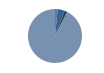
| Category | Series 0 |
|---|---|
| ARRASTRE | 15 |
| CERCO | 40 |
| PALANGRE | 16 |
| REDES DE ENMALLE | 0 |
| ARTES FIJAS | 0 |
| ARTES MENORES | 877 |